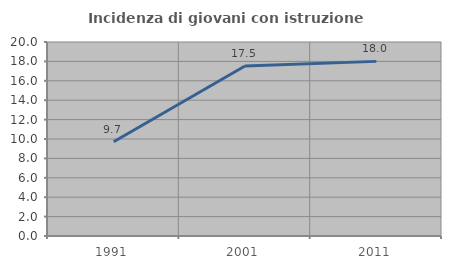
| Category | Incidenza di giovani con istruzione universitaria |
|---|---|
| 1991.0 | 9.722 |
| 2001.0 | 17.523 |
| 2011.0 | 18.003 |